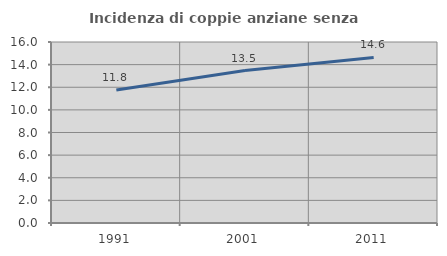
| Category | Incidenza di coppie anziane senza figli  |
|---|---|
| 1991.0 | 11.758 |
| 2001.0 | 13.479 |
| 2011.0 | 14.638 |